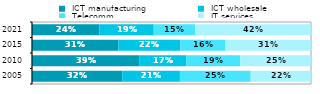
| Category |  ICT manufacturing |  ICT wholesale |  Telecomm. |  IT services |
|---|---|---|---|---|
| 2005.0 | 0.324 | 0.207 | 0.254 | 0.216 |
| 2010.0 | 0.386 | 0.167 | 0.194 | 0.253 |
| 2015.0 | 0.31 | 0.222 | 0.162 | 0.306 |
| 2021.0 | 0.242 | 0.195 | 0.148 | 0.415 |